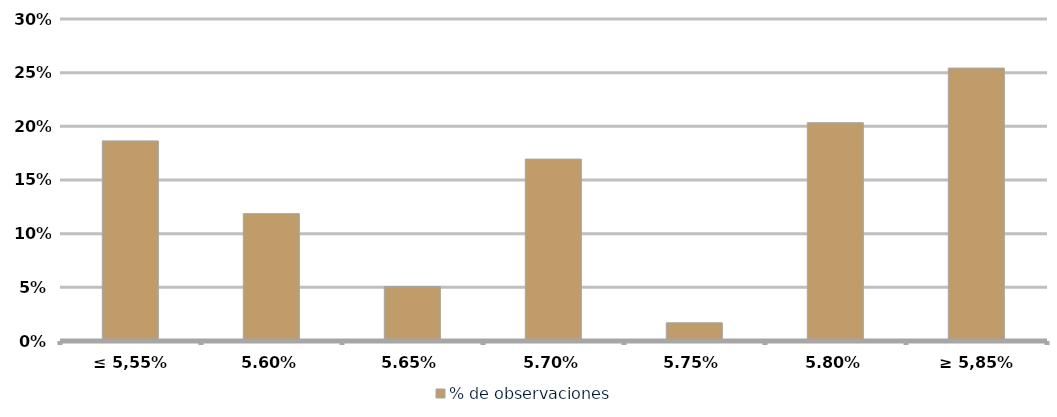
| Category | % de observaciones  |
|---|---|
| ≤ 5,55% | 0.186 |
| 5,60% | 0.119 |
| 5,65% | 0.051 |
| 5,70% | 0.169 |
| 5,75% | 0.017 |
| 5,80% | 0.203 |
| ≥ 5,85% | 0.254 |